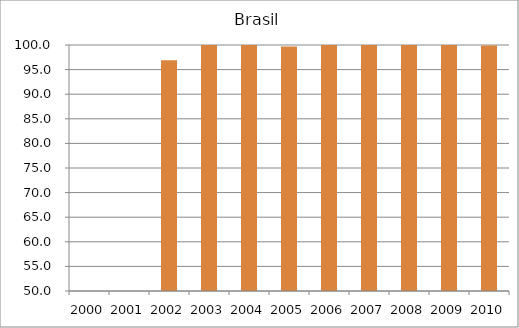
| Category | Brasil |
|---|---|
| 2000.0 | 0 |
| 2001.0 | 0 |
| 2002.0 | 96.9 |
| 2003.0 | 113 |
| 2004.0 | 105 |
| 2005.0 | 99.7 |
| 2006.0 | 102.2 |
| 2007.0 | 104.9 |
| 2008.0 | 101.3 |
| 2009.0 | 101.8 |
| 2010.0 | 99.9 |